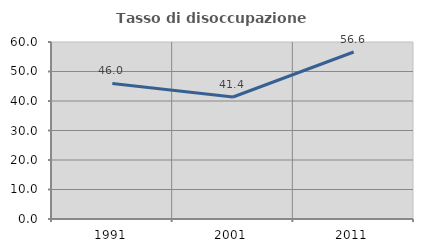
| Category | Tasso di disoccupazione giovanile  |
|---|---|
| 1991.0 | 45.955 |
| 2001.0 | 41.364 |
| 2011.0 | 56.614 |